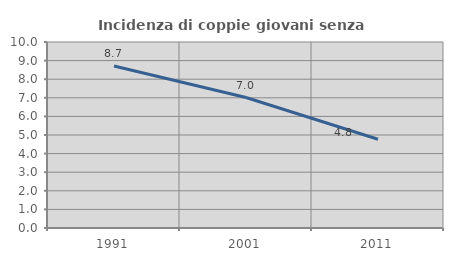
| Category | Incidenza di coppie giovani senza figli |
|---|---|
| 1991.0 | 8.714 |
| 2001.0 | 7.014 |
| 2011.0 | 4.769 |